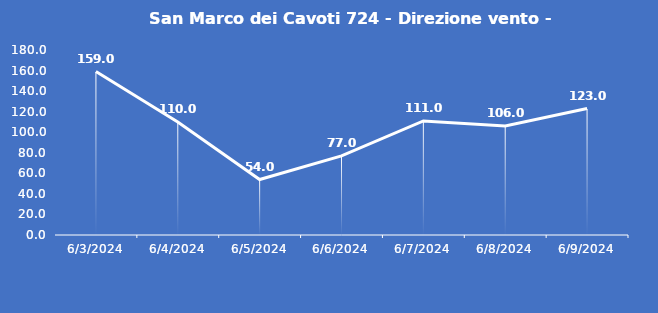
| Category | San Marco dei Cavoti 724 - Direzione vento - Grezzo (°N) |
|---|---|
| 6/3/24 | 159 |
| 6/4/24 | 110 |
| 6/5/24 | 54 |
| 6/6/24 | 77 |
| 6/7/24 | 111 |
| 6/8/24 | 106 |
| 6/9/24 | 123 |